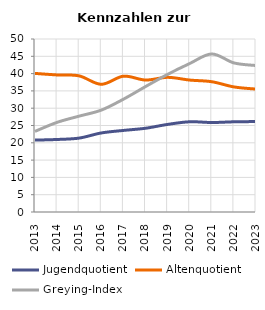
| Category | Jugendquotient | Altenquotient | Greying-Index |
|---|---|---|---|
| 2013.0 | 20.782 | 40.054 | 23.301 |
| 2014.0 | 20.959 | 39.615 | 25.911 |
| 2015.0 | 21.361 | 39.338 | 27.711 |
| 2016.0 | 22.847 | 36.907 | 29.448 |
| 2017.0 | 23.574 | 39.252 | 32.597 |
| 2018.0 | 24.203 | 38.139 | 36.246 |
| 2019.0 | 25.314 | 38.921 | 39.778 |
| 2020.0 | 26.08 | 38.13 | 42.91 |
| 2021.0 | 25.858 | 37.655 | 45.676 |
| 2022.0 | 26.07 | 36.15 | 43.09 |
| 2023.0 | 26.134 | 35.52 | 42.328 |